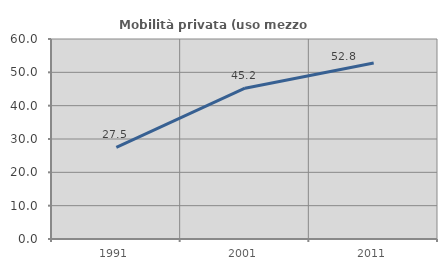
| Category | Mobilità privata (uso mezzo privato) |
|---|---|
| 1991.0 | 27.454 |
| 2001.0 | 45.241 |
| 2011.0 | 52.797 |